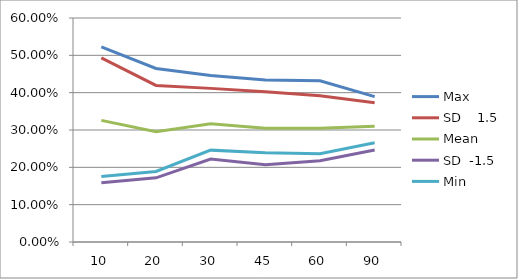
| Category | Max | SD    1.5 | Mean | SD  -1.5 | Min |
|---|---|---|---|---|---|
| 10.0 | 0.523 | 0.493 | 0.326 | 0.159 | 0.175 |
| 20.0 | 0.465 | 0.419 | 0.296 | 0.172 | 0.189 |
| 30.0 | 0.446 | 0.411 | 0.317 | 0.222 | 0.246 |
| 45.0 | 0.434 | 0.402 | 0.305 | 0.207 | 0.239 |
| 60.0 | 0.432 | 0.392 | 0.305 | 0.218 | 0.237 |
| 90.0 | 0.389 | 0.373 | 0.31 | 0.246 | 0.266 |